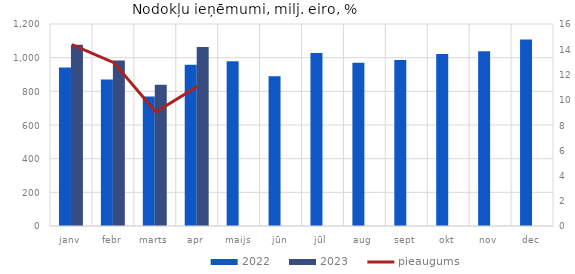
| Category | 2022 | 2023 |
|---|---|---|
| janv | 941.792 | 1077.163 |
| febr | 870.815 | 983.504 |
| marts | 769.055 | 838.446 |
| apr | 957.835 | 1063.867 |
| maijs | 978.679 | 0 |
| jūn | 888.916 | 0 |
| jūl | 1027.457 | 0 |
| aug | 969.994 | 0 |
| sept | 985.436 | 0 |
| okt | 1021.663 | 0 |
| nov | 1038.228 | 0 |
| dec | 1107.409 | 0 |